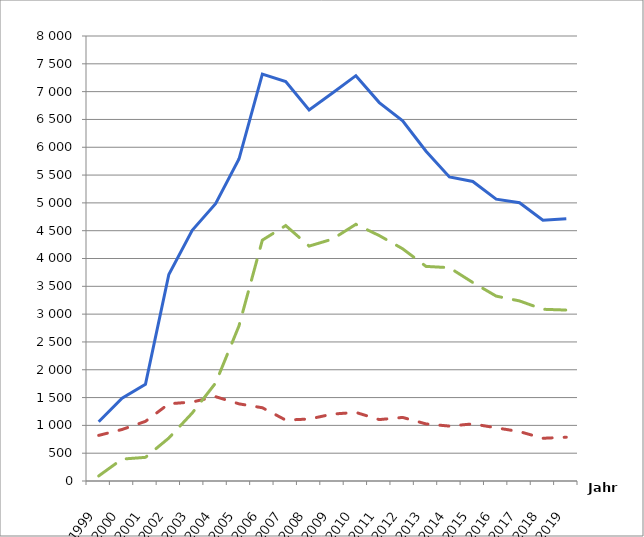
| Category | insgesamt | Unternehmen1 | Verbraucher |
|---|---|---|---|
| 1999.0 | 1064 | 820 | 91 |
| 2000.0 | 1488 | 926 | 394 |
| 2001.0 | 1737 | 1072 | 425 |
| 2002.0 | 3712 | 1388 | 772 |
| 2003.0 | 4507 | 1420 | 1222 |
| 2004.0 | 4984 | 1516 | 1761 |
| 2005.0 | 5788 | 1387 | 2788 |
| 2006.0 | 7315 | 1317 | 4330 |
| 2007.0 | 7181 | 1095 | 4592 |
| 2008.0 | 6671 | 1114 | 4223 |
| 2009.0 | 6976 | 1203 | 4349 |
| 2010.0 | 7287 | 1233 | 4615 |
| 2011.0 | 6803 | 1104 | 4412 |
| 2012.0 | 6477 | 1143 | 4175 |
| 2013.0 | 5928 | 1026 | 3858 |
| 2014.0 | 5467 | 987 | 3835 |
| 2015.0 | 5384 | 1027 | 3569 |
| 2016.0 | 5067 | 956 | 3324 |
| 2017.0 | 5003 | 888 | 3237 |
| 2018.0 | 4688 | 768 | 3087 |
| 2019.0 | 4713 | 787 | 3073 |